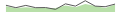
| Category | Series 1 |
|---|---|
| 0 | 56 |
| 1 | 36 |
| 2 | 55 |
| 3 | 36 |
| 4 | 37 |
| 5 | 22 |
| 6 | 68 |
| 7 | 49 |
| 8 | 94 |
| 9 | 49 |
| 10 | 44 |
| 11 | 66 |